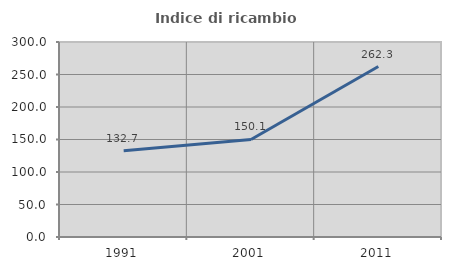
| Category | Indice di ricambio occupazionale  |
|---|---|
| 1991.0 | 132.73 |
| 2001.0 | 150.104 |
| 2011.0 | 262.275 |